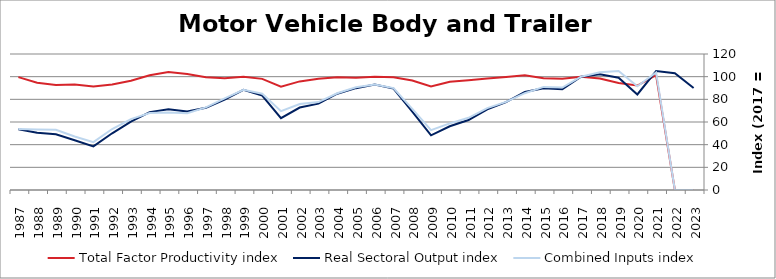
| Category | Total Factor Productivity index | Real Sectoral Output index | Combined Inputs index |
|---|---|---|---|
| 2023.0 | 0 | 89.951 | 0 |
| 2022.0 | 0 | 103.056 | 0 |
| 2021.0 | 101.279 | 104.978 | 103.653 |
| 2020.0 | 92.188 | 84.309 | 91.453 |
| 2019.0 | 94.371 | 99.036 | 104.943 |
| 2018.0 | 98.306 | 102.081 | 103.84 |
| 2017.0 | 100 | 100 | 100 |
| 2016.0 | 98.229 | 88.835 | 90.436 |
| 2015.0 | 98.684 | 89.768 | 90.965 |
| 2014.0 | 101.284 | 86.518 | 85.421 |
| 2013.0 | 99.698 | 77.516 | 77.75 |
| 2012.0 | 98.344 | 71.106 | 72.303 |
| 2011.0 | 96.928 | 61.775 | 63.734 |
| 2010.0 | 95.553 | 56.214 | 58.83 |
| 2009.0 | 91.302 | 48.216 | 52.809 |
| 2008.0 | 96.625 | 69.201 | 71.618 |
| 2007.0 | 99.506 | 89.513 | 89.957 |
| 2006.0 | 100.009 | 92.993 | 92.985 |
| 2005.0 | 99.058 | 89.868 | 90.723 |
| 2004.0 | 99.589 | 84.989 | 85.34 |
| 2003.0 | 98.194 | 76.171 | 77.572 |
| 2002.0 | 95.815 | 72.755 | 75.933 |
| 2001.0 | 91.111 | 63.343 | 69.523 |
| 2000.0 | 98.065 | 83.315 | 84.959 |
| 1999.0 | 99.982 | 88.324 | 88.34 |
| 1998.0 | 98.646 | 79.735 | 80.83 |
| 1997.0 | 99.535 | 72.515 | 72.854 |
| 1996.0 | 102.348 | 69.282 | 67.692 |
| 1995.0 | 104.194 | 71.244 | 68.376 |
| 1994.0 | 101.263 | 68.726 | 67.869 |
| 1993.0 | 96.428 | 60.299 | 62.533 |
| 1992.0 | 93.057 | 50.046 | 53.78 |
| 1991.0 | 91.261 | 38.535 | 42.225 |
| 1990.0 | 93.01 | 43.863 | 47.16 |
| 1989.0 | 92.629 | 49.237 | 53.156 |
| 1988.0 | 94.68 | 50.612 | 53.456 |
| 1987.0 | 99.608 | 53.583 | 53.794 |